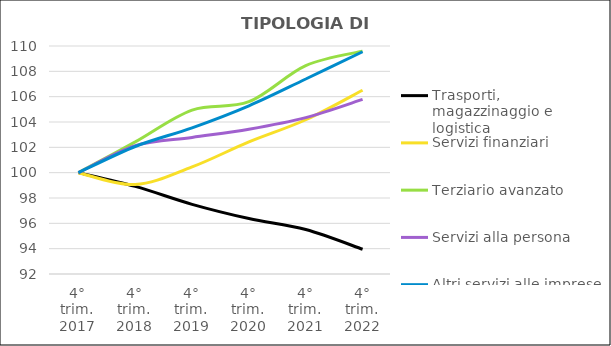
| Category | Trasporti, magazzinaggio e logistica | Servizi finanziari | Terziario avanzato  | Servizi alla persona  | Altri servizi alle imprese |
|---|---|---|---|---|---|
| 4° trim.
2017 | 100 | 100 | 100 | 100 | 100 |
| 4° trim.
2018 | 98.913 | 99.061 | 102.43 | 102.134 | 102.066 |
| 4° trim.
2019 | 97.501 | 100.453 | 104.941 | 102.783 | 103.54 |
| 4° trim.
2020 | 96.378 | 102.429 | 105.601 | 103.432 | 105.28 |
| 4° trim.
2021 | 95.509 | 104.177 | 108.45 | 104.344 | 107.395 |
| 4° trim.
2022 | 93.951 | 106.509 | 109.593 | 105.782 | 109.546 |